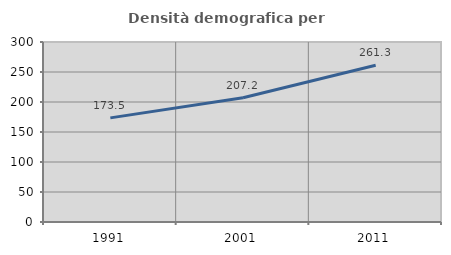
| Category | Densità demografica |
|---|---|
| 1991.0 | 173.549 |
| 2001.0 | 207.159 |
| 2011.0 | 261.261 |